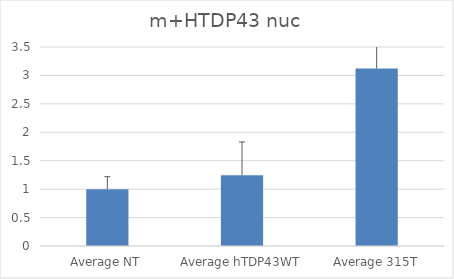
| Category | Series 0 |
|---|---|
| Average NT | 1 |
| Average hTDP43WT | 1.246 |
| Average 315T | 3.123 |